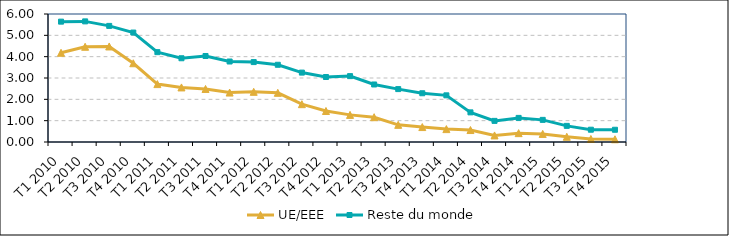
| Category | UE/EEE | Reste du monde |
|---|---|---|
| T1 2010 | 4.182 | 5.642 |
| T2 2010 | 4.464 | 5.654 |
| T3 2010 | 4.478 | 5.442 |
| T4 2010 | 3.692 | 5.13 |
| T1 2011 | 2.714 | 4.212 |
| T2 2011 | 2.558 | 3.925 |
| T3 2011 | 2.486 | 4.032 |
| T4 2011 | 2.318 | 3.773 |
| T1 2012 | 2.351 | 3.746 |
| T2 2012 | 2.305 | 3.62 |
| T3 2012 | 1.773 | 3.253 |
| T4 2012 | 1.453 | 3.046 |
| T1 2013 | 1.271 | 3.088 |
| T2 2013 | 1.163 | 2.697 |
| T3 2013 | 0.804 | 2.479 |
| T4 2013 | 0.7 | 2.285 |
| T1 2014 | 0.604 | 2.187 |
| T2 2014 | 0.561 | 1.389 |
| T3 2014 | 0.308 | 0.99 |
| T4 2014 | 0.415 | 1.129 |
| T1 2015 | 0.379 | 1.037 |
| T2 2015 | 0.245 | 0.756 |
| T3 2015 | 0.142 | 0.576 |
| T4 2015 | 0.128 | 0.574 |